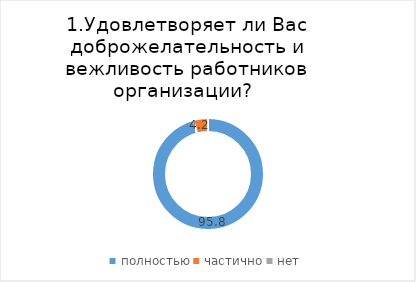
| Category | Кривошеинский |
|---|---|
| полностью | 95.785 |
| частично | 4.215 |
| нет | 0 |